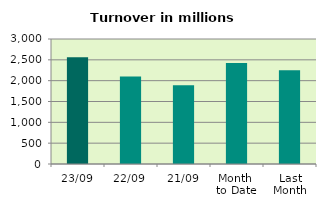
| Category | Series 0 |
|---|---|
| 23/09 | 2561.083 |
| 22/09 | 2102.618 |
| 21/09 | 1890.242 |
| Month 
to Date | 2425.959 |
| Last
Month | 2249.305 |